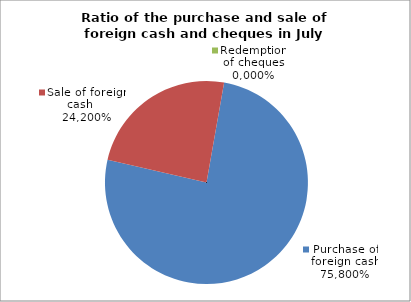
| Category | Purchase of foreign cash |
|---|---|
| 0 | 0.758 |
| 1 | 0.242 |
| 2 | 0 |